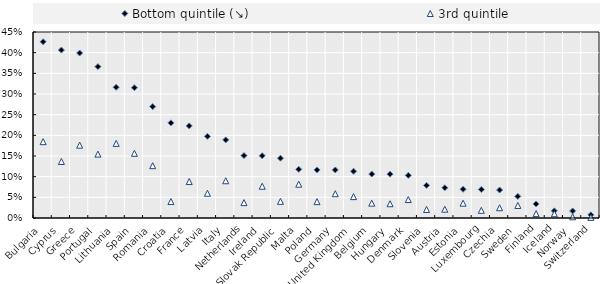
| Category | Bottom quintile (↘) | 3rd quintile |
|---|---|---|
| Bulgaria | 0.426 | 0.185 |
| Cyprus | 0.406 | 0.137 |
| Greece | 0.399 | 0.176 |
| Portugal | 0.366 | 0.155 |
| Lithuania | 0.316 | 0.181 |
| Spain | 0.315 | 0.157 |
| Romania | 0.27 | 0.127 |
| Croatia | 0.23 | 0.04 |
| France | 0.223 | 0.088 |
| Latvia | 0.198 | 0.06 |
| Italy | 0.189 | 0.09 |
| Netherlands | 0.151 | 0.037 |
| Ireland | 0.151 | 0.077 |
| Slovak Republic | 0.145 | 0.04 |
| Malta | 0.118 | 0.082 |
| Poland | 0.116 | 0.04 |
| Germany | 0.116 | 0.059 |
| United Kingdom | 0.113 | 0.052 |
| Belgium | 0.106 | 0.036 |
| Hungary | 0.106 | 0.035 |
| Denmark | 0.103 | 0.045 |
| Slovenia | 0.079 | 0.021 |
| Austria | 0.073 | 0.021 |
| Estonia | 0.07 | 0.036 |
| Luxembourg | 0.069 | 0.019 |
| Czechia | 0.068 | 0.025 |
| Sweden | 0.052 | 0.03 |
| Finland | 0.034 | 0.011 |
| Iceland | 0.017 | 0.01 |
| Norway | 0.017 | 0.003 |
| Switzerland | 0.008 | 0.001 |